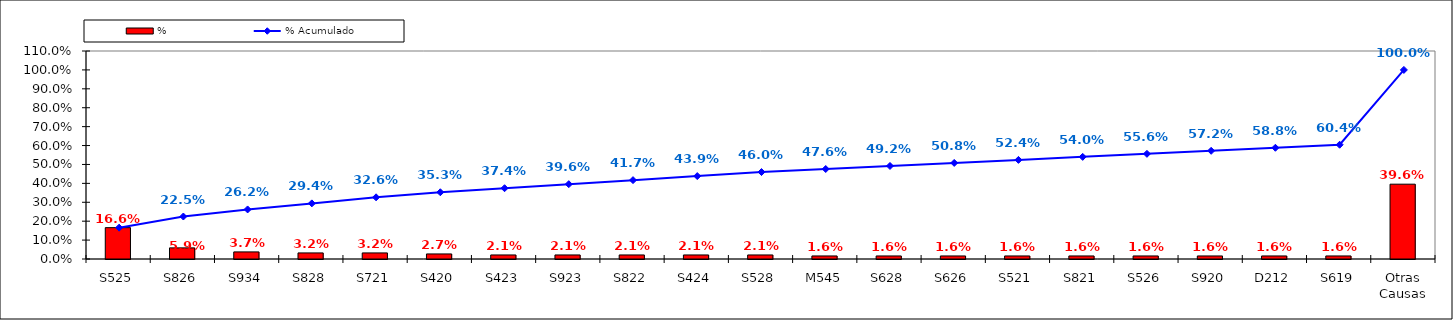
| Category | % |
|---|---|
| S525 | 0.166 |
| S826 | 0.059 |
| S934 | 0.037 |
| S828 | 0.032 |
| S721 | 0.032 |
| S420 | 0.027 |
| S423 | 0.021 |
| S923 | 0.021 |
| S822 | 0.021 |
| S424 | 0.021 |
| S528 | 0.021 |
| M545 | 0.016 |
| S628 | 0.016 |
| S626 | 0.016 |
| S521 | 0.016 |
| S821 | 0.016 |
| S526 | 0.016 |
| S920 | 0.016 |
| D212 | 0.016 |
| S619 | 0.016 |
| Otras Causas | 0.396 |